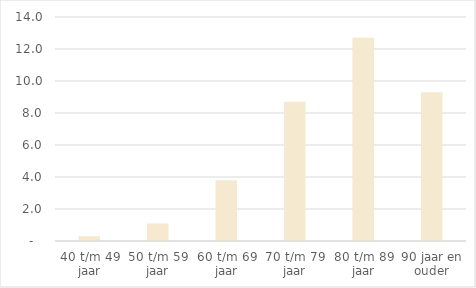
| Category | % 40 plussers ≥ 3 aandoeningen |
|---|---|
| 40 t/m 49 jaar | 0.3 |
| 50 t/m 59 jaar | 1.1 |
| 60 t/m 69 jaar | 3.8 |
| 70 t/m 79 jaar | 8.7 |
| 80 t/m 89 jaar | 12.7 |
| 90 jaar en ouder | 9.3 |